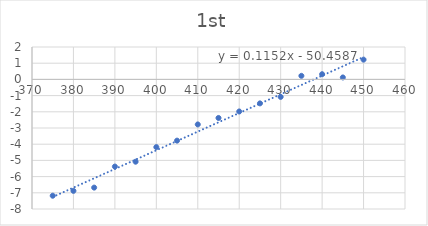
| Category | Series 0 |
|---|---|
| 375.0 | -7.18 |
| 380.0 | -6.88 |
| 385.0 | -6.68 |
| 390.0 | -5.38 |
| 395.0 | -5.08 |
| 400.0 | -4.18 |
| 405.0 | -3.78 |
| 410.0 | -2.78 |
| 415.0 | -2.38 |
| 420.0 | -1.98 |
| 425.0 | -1.48 |
| 430.0 | -1.08 |
| 435.0 | 0.22 |
| 440.0 | 0.32 |
| 445.0 | 0.12 |
| 450.0 | 1.22 |